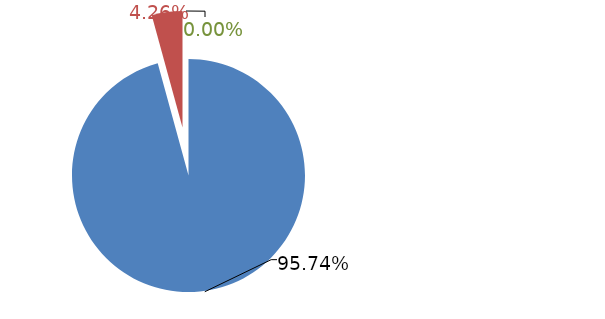
| Category | Series 0 |
|---|---|
| Soltero(a) | 0.957 |
| Casado(a)/unión libre | 0.043 |
| Otro | 0 |